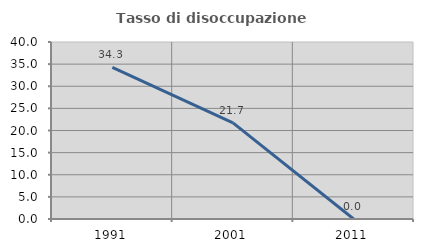
| Category | Tasso di disoccupazione giovanile  |
|---|---|
| 1991.0 | 34.286 |
| 2001.0 | 21.739 |
| 2011.0 | 0 |